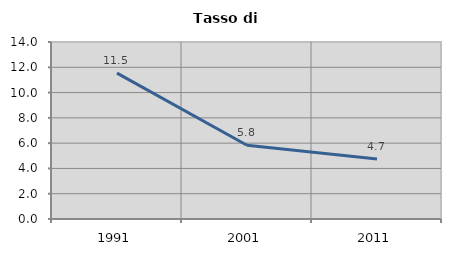
| Category | Tasso di disoccupazione   |
|---|---|
| 1991.0 | 11.534 |
| 2001.0 | 5.833 |
| 2011.0 | 4.737 |